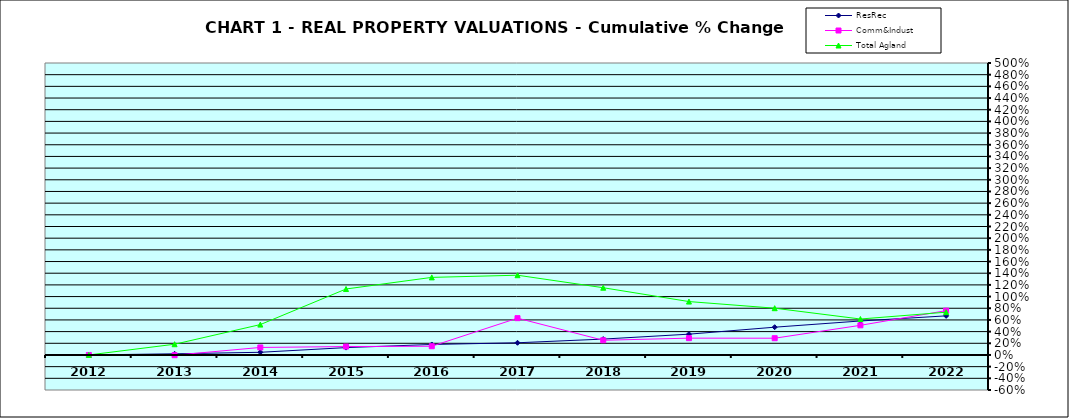
| Category | ResRec | Comm&Indust | Total Agland |
|---|---|---|---|
| 2012.0 | 0 | 0 | 0 |
| 2013.0 | 0.02 | -0.004 | 0.184 |
| 2014.0 | 0.046 | 0.129 | 0.52 |
| 2015.0 | 0.126 | 0.144 | 1.13 |
| 2016.0 | 0.18 | 0.149 | 1.329 |
| 2017.0 | 0.209 | 0.63 | 1.366 |
| 2018.0 | 0.272 | 0.252 | 1.151 |
| 2019.0 | 0.356 | 0.288 | 0.914 |
| 2020.0 | 0.476 | 0.287 | 0.801 |
| 2021.0 | 0.582 | 0.508 | 0.616 |
| 2022.0 | 0.67 | 0.759 | 0.732 |